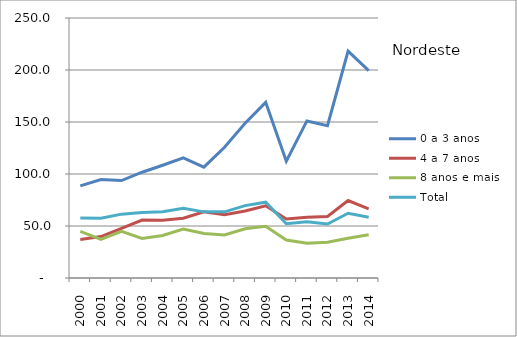
| Category | 0 a 3 anos | 4 a 7 anos | 8 anos e mais | Total |
|---|---|---|---|---|
| 2000.0 | 88.6 | 37.1 | 44.9 | 57.7 |
| 2001.0 | 94.6 | 39.8 | 37.1 | 57.4 |
| 2002.0 | 93.7 | 47.7 | 44.9 | 61.4 |
| 2003.0 | 101.7 | 55.7 | 38 | 63 |
| 2004.0 | 108.4 | 55.6 | 40.9 | 63.7 |
| 2005.0 | 115.6 | 57.4 | 47.1 | 67 |
| 2006.0 | 106.6 | 63.6 | 42.8 | 63.6 |
| 2007.0 | 125.7 | 60.8 | 41.4 | 63.6 |
| 2008.0 | 148.8 | 64.4 | 47.3 | 69.6 |
| 2009.0 | 168.9 | 69.4 | 49.7 | 72.9 |
| 2010.0 | 112.26 | 56.736 | 36.507 | 52.238 |
| 2011.0 | 151.022 | 58.37 | 33.382 | 53.964 |
| 2012.0 | 146.393 | 59.103 | 34.39 | 51.912 |
| 2013.0 | 218.221 | 74.526 | 38.258 | 62.245 |
| 2014.0 | 199.323 | 66.567 | 41.543 | 58.401 |